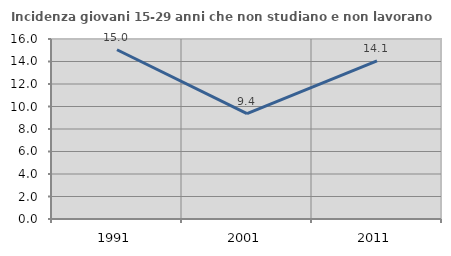
| Category | Incidenza giovani 15-29 anni che non studiano e non lavorano  |
|---|---|
| 1991.0 | 15.044 |
| 2001.0 | 9.375 |
| 2011.0 | 14.054 |